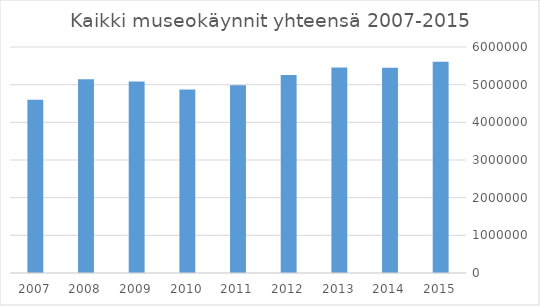
| Category | Kaikki käynnit yhteensä |
|---|---|
| 2015.0 | 5607389 |
| 2014.0 | 5447482 |
| 2013.0 | 5453648 |
| 2012.0 | 5256183 |
| 2011.0 | 4987428 |
| 2010.0 | 4871045 |
| 2009.0 | 5083933 |
| 2008.0 | 5143385 |
| 2007.0 | 4599027 |